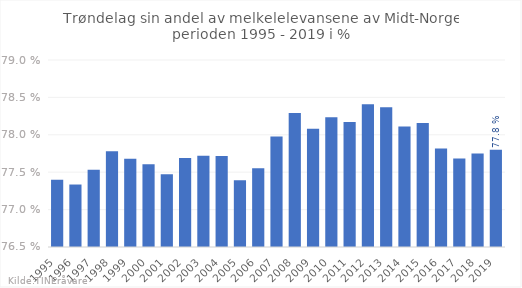
| Category | Trøndelag |
|---|---|
| 1995.0 | 0.774 |
| 1996.0 | 0.773 |
| 1997.0 | 0.775 |
| 1998.0 | 0.778 |
| 1999.0 | 0.777 |
| 2000.0 | 0.776 |
| 2001.0 | 0.775 |
| 2002.0 | 0.777 |
| 2003.0 | 0.777 |
| 2004.0 | 0.777 |
| 2005.0 | 0.774 |
| 2006.0 | 0.776 |
| 2007.0 | 0.78 |
| 2008.0 | 0.783 |
| 2009.0 | 0.781 |
| 2010.0 | 0.782 |
| 2011.0 | 0.782 |
| 2012.0 | 0.784 |
| 2013.0 | 0.784 |
| 2014.0 | 0.781 |
| 2015.0 | 0.782 |
| 2016.0 | 0.778 |
| 2017.0 | 0.777 |
| 2018.0 | 0.777 |
| 2019.0 | 0.778 |